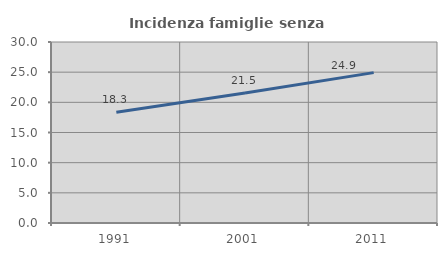
| Category | Incidenza famiglie senza nuclei |
|---|---|
| 1991.0 | 18.35 |
| 2001.0 | 21.545 |
| 2011.0 | 24.925 |